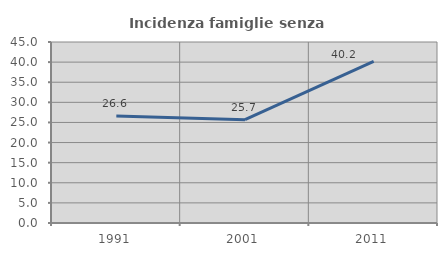
| Category | Incidenza famiglie senza nuclei |
|---|---|
| 1991.0 | 26.581 |
| 2001.0 | 25.676 |
| 2011.0 | 40.194 |